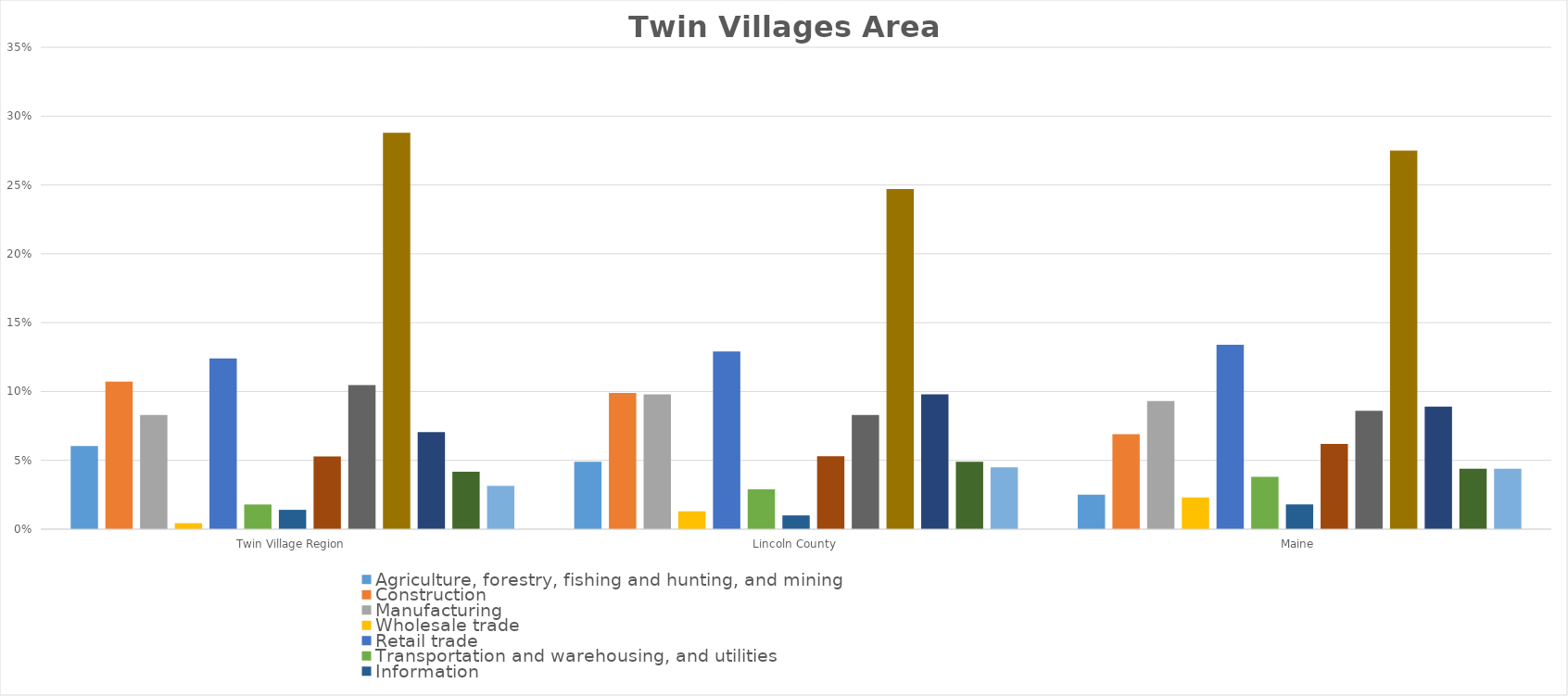
| Category | Agriculture, forestry, fishing and hunting, and mining | Construction | Manufacturing | Wholesale trade | Retail trade | Transportation and warehousing, and utilities | Information | Finance and insurance, and real estate and rental and leasing | Professional, scientific, and management, and administrative and waste management services | Educational services, and health care and social assistance | Arts, entertainment, and recreation, and accommodation and food services |  Other services, except public administration | Public administration |
|---|---|---|---|---|---|---|---|---|---|---|---|---|---|
| Twin Village Region | 0.06 | 0.107 | 0.083 | 0.004 | 0.124 | 0.018 | 0.014 | 0.053 | 0.105 | 0.288 | 0.071 | 0.042 | 0.032 |
| Lincoln County | 0.049 | 0.099 | 0.098 | 0.013 | 0.129 | 0.029 | 0.01 | 0.053 | 0.083 | 0.247 | 0.098 | 0.049 | 0.045 |
| Maine | 0.025 | 0.069 | 0.093 | 0.023 | 0.134 | 0.038 | 0.018 | 0.062 | 0.086 | 0.275 | 0.089 | 0.044 | 0.044 |